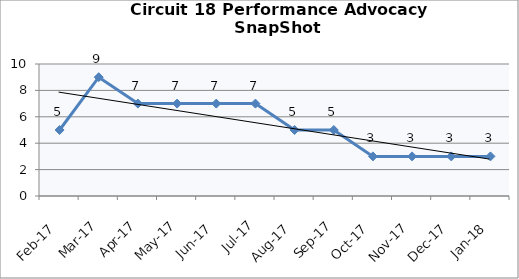
| Category | Circuit 18 |
|---|---|
| Feb-17 | 5 |
| Mar-17 | 9 |
| Apr-17 | 7 |
| May-17 | 7 |
| Jun-17 | 7 |
| Jul-17 | 7 |
| Aug-17 | 5 |
| Sep-17 | 5 |
| Oct-17 | 3 |
| Nov-17 | 3 |
| Dec-17 | 3 |
| Jan-18 | 3 |